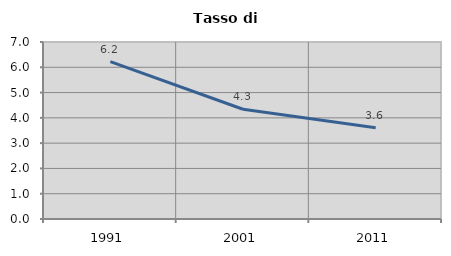
| Category | Tasso di disoccupazione   |
|---|---|
| 1991.0 | 6.227 |
| 2001.0 | 4.341 |
| 2011.0 | 3.612 |